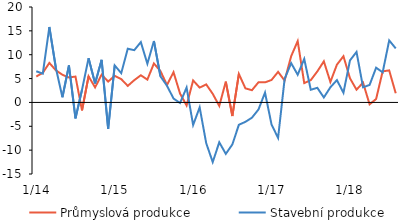
| Category | Průmyslová produkce | Stavební produkce |
|---|---|---|
|  1/14 | 5.435 | 6.535 |
| 2 | 6.203 | 6.04 |
| 3 | 8.282 | 15.803 |
| 4 | 6.732 | 7.213 |
| 5 | 5.797 | 1.076 |
| 6 | 5.226 | 7.745 |
| 7 | 5.423 | -3.345 |
| 8 | -1.669 | 2.642 |
| 9 | 5.481 | 9.274 |
| 10 | 3.151 | 3.981 |
| 11 | 5.822 | 8.927 |
| 12 | 4.37 | -5.544 |
|  1/15 | 5.578 | 7.759 |
| 2 | 4.89 | 6.116 |
| 3 | 3.468 | 11.265 |
| 4 | 4.673 | 10.95 |
| 5 | 5.689 | 12.639 |
| 6 | 4.783 | 8.09 |
| 7 | 8.163 | 12.87 |
| 8 | 6.583 | 5.463 |
| 9 | 3.645 | 3.505 |
| 10 | 6.344 | 0.81 |
| 11 | 1.856 | -0.116 |
| 12 | -0.637 | 3.115 |
|  1/16 | 4.608 | -4.732 |
| 2 | 3.106 | -1.034 |
| 3 | 3.783 | -8.533 |
| 4 | 1.799 | -12.506 |
| 5 | -0.727 | -8.357 |
| 6 | 4.352 | -10.781 |
| 7 | -2.847 | -8.809 |
| 8 | 5.968 | -4.683 |
| 9 | 2.948 | -4.069 |
| 10 | 2.563 | -3.198 |
| 11 | 4.227 | -1.485 |
| 12 | 4.203 | 2.056 |
|  1/17 | 4.707 | -4.643 |
| 2 | 6.407 | -7.434 |
| 3 | 4.587 | 4.939 |
| 4 | 9.686 | 8.239 |
| 5 | 12.854 | 5.803 |
| 6 | 4.051 | 9.117 |
| 7 | 4.665 | 2.657 |
| 8 | 6.488 | 3.064 |
| 9 | 8.611 | 1.042 |
| 10 | 4.289 | 3.173 |
| 11 | 7.913 | 4.679 |
| 12 | 9.684 | 2.027 |
|  1/18 | 5.058 | 8.812 |
| 2 | 2.67 | 10.577 |
| 3 | 4.144 | 3.17 |
| 4 | -0.4 | 3.664 |
| 5 | 0.724 | 7.276 |
| 6 | 6.511 | 6.307 |
| 7 | 6.714 | 12.993 |
| 8 | 1.918 | 11.323 |